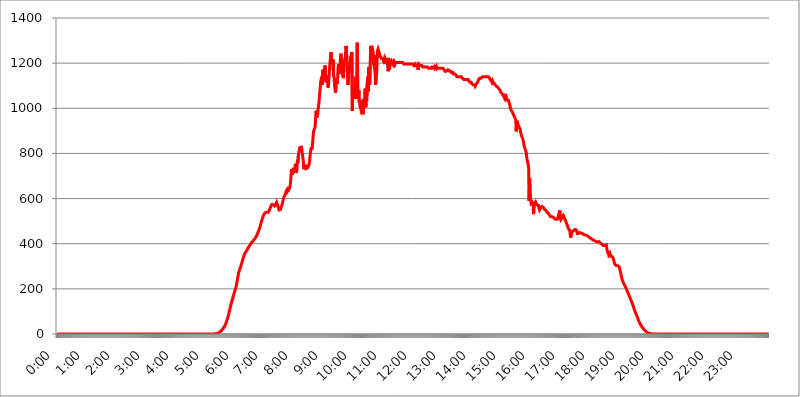
| Category | 2015.04.21. Intenzitás [W/m^2] |
|---|---|
| 0.0 | -0.256 |
| 0.0006944444444444445 | -0.256 |
| 0.001388888888888889 | -0.256 |
| 0.0020833333333333333 | -0.256 |
| 0.002777777777777778 | -0.256 |
| 0.003472222222222222 | -0.256 |
| 0.004166666666666667 | -0.256 |
| 0.004861111111111111 | -0.256 |
| 0.005555555555555556 | -0.256 |
| 0.0062499999999999995 | -0.256 |
| 0.006944444444444444 | -0.256 |
| 0.007638888888888889 | -0.256 |
| 0.008333333333333333 | -0.256 |
| 0.009027777777777779 | -0.256 |
| 0.009722222222222222 | -0.256 |
| 0.010416666666666666 | -0.256 |
| 0.011111111111111112 | -0.256 |
| 0.011805555555555555 | -0.256 |
| 0.012499999999999999 | -0.256 |
| 0.013194444444444444 | -0.256 |
| 0.013888888888888888 | -0.256 |
| 0.014583333333333332 | -0.256 |
| 0.015277777777777777 | -0.256 |
| 0.015972222222222224 | -0.256 |
| 0.016666666666666666 | -0.256 |
| 0.017361111111111112 | -0.256 |
| 0.018055555555555557 | -0.256 |
| 0.01875 | -0.256 |
| 0.019444444444444445 | -0.256 |
| 0.02013888888888889 | -0.256 |
| 0.020833333333333332 | -0.256 |
| 0.02152777777777778 | -0.256 |
| 0.022222222222222223 | -0.256 |
| 0.02291666666666667 | -0.256 |
| 0.02361111111111111 | -0.256 |
| 0.024305555555555556 | -0.256 |
| 0.024999999999999998 | -0.256 |
| 0.025694444444444447 | -0.256 |
| 0.02638888888888889 | -0.256 |
| 0.027083333333333334 | -0.256 |
| 0.027777777777777776 | -0.256 |
| 0.02847222222222222 | -0.256 |
| 0.029166666666666664 | -0.256 |
| 0.029861111111111113 | -0.256 |
| 0.030555555555555555 | -0.256 |
| 0.03125 | -0.256 |
| 0.03194444444444445 | -0.256 |
| 0.03263888888888889 | -0.256 |
| 0.03333333333333333 | -0.256 |
| 0.034027777777777775 | -0.256 |
| 0.034722222222222224 | -0.256 |
| 0.035416666666666666 | -0.256 |
| 0.036111111111111115 | -0.256 |
| 0.03680555555555556 | -0.256 |
| 0.0375 | -0.256 |
| 0.03819444444444444 | -0.256 |
| 0.03888888888888889 | -0.256 |
| 0.03958333333333333 | -0.256 |
| 0.04027777777777778 | -0.256 |
| 0.04097222222222222 | -0.256 |
| 0.041666666666666664 | -0.256 |
| 0.042361111111111106 | -0.256 |
| 0.04305555555555556 | -0.256 |
| 0.043750000000000004 | -0.256 |
| 0.044444444444444446 | -0.256 |
| 0.04513888888888889 | -0.256 |
| 0.04583333333333334 | -0.256 |
| 0.04652777777777778 | -0.256 |
| 0.04722222222222222 | -0.256 |
| 0.04791666666666666 | -0.256 |
| 0.04861111111111111 | -0.256 |
| 0.049305555555555554 | -0.256 |
| 0.049999999999999996 | -0.256 |
| 0.05069444444444445 | -0.256 |
| 0.051388888888888894 | -0.256 |
| 0.052083333333333336 | -0.256 |
| 0.05277777777777778 | -0.256 |
| 0.05347222222222222 | -0.256 |
| 0.05416666666666667 | -0.256 |
| 0.05486111111111111 | -0.256 |
| 0.05555555555555555 | -0.256 |
| 0.05625 | -0.256 |
| 0.05694444444444444 | -0.256 |
| 0.057638888888888885 | -0.256 |
| 0.05833333333333333 | -0.256 |
| 0.05902777777777778 | -0.256 |
| 0.059722222222222225 | -0.256 |
| 0.06041666666666667 | -0.256 |
| 0.061111111111111116 | -0.256 |
| 0.06180555555555556 | -0.256 |
| 0.0625 | -0.256 |
| 0.06319444444444444 | -0.256 |
| 0.06388888888888888 | -0.256 |
| 0.06458333333333334 | -0.256 |
| 0.06527777777777778 | -0.256 |
| 0.06597222222222222 | -0.256 |
| 0.06666666666666667 | -0.256 |
| 0.06736111111111111 | -0.256 |
| 0.06805555555555555 | -0.256 |
| 0.06874999999999999 | -0.256 |
| 0.06944444444444443 | -0.256 |
| 0.07013888888888889 | -0.256 |
| 0.07083333333333333 | -0.256 |
| 0.07152777777777779 | -0.256 |
| 0.07222222222222223 | -0.256 |
| 0.07291666666666667 | -0.256 |
| 0.07361111111111111 | -0.256 |
| 0.07430555555555556 | -0.256 |
| 0.075 | -0.256 |
| 0.07569444444444444 | -0.256 |
| 0.0763888888888889 | -0.256 |
| 0.07708333333333334 | -0.256 |
| 0.07777777777777778 | -0.256 |
| 0.07847222222222222 | -0.256 |
| 0.07916666666666666 | -0.256 |
| 0.0798611111111111 | -0.256 |
| 0.08055555555555556 | -0.256 |
| 0.08125 | -0.256 |
| 0.08194444444444444 | -0.256 |
| 0.08263888888888889 | -0.256 |
| 0.08333333333333333 | -0.256 |
| 0.08402777777777777 | -0.256 |
| 0.08472222222222221 | -0.256 |
| 0.08541666666666665 | -0.256 |
| 0.08611111111111112 | -0.256 |
| 0.08680555555555557 | -0.256 |
| 0.08750000000000001 | -0.256 |
| 0.08819444444444445 | -0.256 |
| 0.08888888888888889 | -0.256 |
| 0.08958333333333333 | -0.256 |
| 0.09027777777777778 | -0.256 |
| 0.09097222222222222 | -0.256 |
| 0.09166666666666667 | -0.256 |
| 0.09236111111111112 | -0.256 |
| 0.09305555555555556 | -0.256 |
| 0.09375 | -0.256 |
| 0.09444444444444444 | -0.256 |
| 0.09513888888888888 | -0.256 |
| 0.09583333333333333 | -0.256 |
| 0.09652777777777777 | -0.256 |
| 0.09722222222222222 | -0.256 |
| 0.09791666666666667 | -0.256 |
| 0.09861111111111111 | -0.256 |
| 0.09930555555555555 | -0.256 |
| 0.09999999999999999 | -0.256 |
| 0.10069444444444443 | -0.256 |
| 0.1013888888888889 | -0.256 |
| 0.10208333333333335 | -0.256 |
| 0.10277777777777779 | -0.256 |
| 0.10347222222222223 | -0.256 |
| 0.10416666666666667 | -0.256 |
| 0.10486111111111111 | -0.256 |
| 0.10555555555555556 | -0.256 |
| 0.10625 | -0.256 |
| 0.10694444444444444 | -0.256 |
| 0.1076388888888889 | -0.256 |
| 0.10833333333333334 | -0.256 |
| 0.10902777777777778 | -0.256 |
| 0.10972222222222222 | -0.256 |
| 0.1111111111111111 | -0.256 |
| 0.11180555555555556 | -0.256 |
| 0.11180555555555556 | -0.256 |
| 0.1125 | -0.256 |
| 0.11319444444444444 | -0.256 |
| 0.11388888888888889 | -0.256 |
| 0.11458333333333333 | -0.256 |
| 0.11527777777777777 | -0.256 |
| 0.11597222222222221 | -0.256 |
| 0.11666666666666665 | -0.256 |
| 0.1173611111111111 | -0.256 |
| 0.11805555555555557 | -0.256 |
| 0.11944444444444445 | -0.256 |
| 0.12013888888888889 | -0.256 |
| 0.12083333333333333 | -0.256 |
| 0.12152777777777778 | -0.256 |
| 0.12222222222222223 | -0.256 |
| 0.12291666666666667 | -0.256 |
| 0.12291666666666667 | -0.256 |
| 0.12361111111111112 | -0.256 |
| 0.12430555555555556 | -0.256 |
| 0.125 | -0.256 |
| 0.12569444444444444 | -0.256 |
| 0.12638888888888888 | -0.256 |
| 0.12708333333333333 | -0.256 |
| 0.16875 | -0.256 |
| 0.12847222222222224 | -0.256 |
| 0.12916666666666668 | -0.256 |
| 0.12986111111111112 | -0.256 |
| 0.13055555555555556 | -0.256 |
| 0.13125 | -0.256 |
| 0.13194444444444445 | -0.256 |
| 0.1326388888888889 | -0.256 |
| 0.13333333333333333 | -0.256 |
| 0.13402777777777777 | -0.256 |
| 0.13402777777777777 | -0.256 |
| 0.13472222222222222 | -0.256 |
| 0.13541666666666666 | -0.256 |
| 0.1361111111111111 | -0.256 |
| 0.13749999999999998 | -0.256 |
| 0.13819444444444443 | -0.256 |
| 0.1388888888888889 | -0.256 |
| 0.13958333333333334 | -0.256 |
| 0.14027777777777778 | -0.256 |
| 0.14097222222222222 | -0.256 |
| 0.14166666666666666 | -0.256 |
| 0.1423611111111111 | -0.256 |
| 0.14305555555555557 | -0.256 |
| 0.14375000000000002 | -0.256 |
| 0.14444444444444446 | -0.256 |
| 0.1451388888888889 | -0.256 |
| 0.1451388888888889 | -0.256 |
| 0.14652777777777778 | -0.256 |
| 0.14722222222222223 | -0.256 |
| 0.14791666666666667 | -0.256 |
| 0.1486111111111111 | -0.256 |
| 0.14930555555555555 | -0.256 |
| 0.15 | -0.256 |
| 0.15069444444444444 | -0.256 |
| 0.15138888888888888 | -0.256 |
| 0.15208333333333332 | -0.256 |
| 0.15277777777777776 | -0.256 |
| 0.15347222222222223 | -0.256 |
| 0.15416666666666667 | -0.256 |
| 0.15486111111111112 | -0.256 |
| 0.15555555555555556 | -0.256 |
| 0.15625 | -0.256 |
| 0.15694444444444444 | -0.256 |
| 0.15763888888888888 | -0.256 |
| 0.15833333333333333 | -0.256 |
| 0.15902777777777777 | -0.256 |
| 0.15972222222222224 | -0.256 |
| 0.16041666666666668 | -0.256 |
| 0.16111111111111112 | -0.256 |
| 0.16180555555555556 | -0.256 |
| 0.1625 | -0.256 |
| 0.16319444444444445 | -0.256 |
| 0.1638888888888889 | -0.256 |
| 0.16458333333333333 | -0.256 |
| 0.16527777777777777 | -0.256 |
| 0.16597222222222222 | -0.256 |
| 0.16666666666666666 | -0.256 |
| 0.1673611111111111 | -0.256 |
| 0.16805555555555554 | -0.256 |
| 0.16874999999999998 | -0.256 |
| 0.16944444444444443 | -0.256 |
| 0.17013888888888887 | -0.256 |
| 0.1708333333333333 | -0.256 |
| 0.17152777777777775 | -0.256 |
| 0.17222222222222225 | -0.256 |
| 0.1729166666666667 | -0.256 |
| 0.17361111111111113 | -0.256 |
| 0.17430555555555557 | -0.256 |
| 0.17500000000000002 | -0.256 |
| 0.17569444444444446 | -0.256 |
| 0.1763888888888889 | -0.256 |
| 0.17708333333333334 | -0.256 |
| 0.17777777777777778 | -0.256 |
| 0.17847222222222223 | -0.256 |
| 0.17916666666666667 | -0.256 |
| 0.1798611111111111 | -0.256 |
| 0.18055555555555555 | -0.256 |
| 0.18125 | -0.256 |
| 0.18194444444444444 | -0.256 |
| 0.1826388888888889 | -0.256 |
| 0.18333333333333335 | -0.256 |
| 0.1840277777777778 | -0.256 |
| 0.18472222222222223 | -0.256 |
| 0.18541666666666667 | -0.256 |
| 0.18611111111111112 | -0.256 |
| 0.18680555555555556 | -0.256 |
| 0.1875 | -0.256 |
| 0.18819444444444444 | -0.256 |
| 0.18888888888888888 | -0.256 |
| 0.18958333333333333 | -0.256 |
| 0.19027777777777777 | -0.256 |
| 0.1909722222222222 | -0.256 |
| 0.19166666666666665 | -0.256 |
| 0.19236111111111112 | -0.256 |
| 0.19305555555555554 | -0.256 |
| 0.19375 | -0.256 |
| 0.19444444444444445 | -0.256 |
| 0.1951388888888889 | -0.256 |
| 0.19583333333333333 | -0.256 |
| 0.19652777777777777 | -0.256 |
| 0.19722222222222222 | -0.256 |
| 0.19791666666666666 | -0.256 |
| 0.1986111111111111 | -0.256 |
| 0.19930555555555554 | -0.256 |
| 0.19999999999999998 | -0.256 |
| 0.20069444444444443 | -0.256 |
| 0.20138888888888887 | -0.256 |
| 0.2020833333333333 | -0.256 |
| 0.2027777777777778 | -0.256 |
| 0.2034722222222222 | -0.256 |
| 0.2041666666666667 | -0.256 |
| 0.20486111111111113 | -0.256 |
| 0.20555555555555557 | -0.256 |
| 0.20625000000000002 | -0.256 |
| 0.20694444444444446 | -0.256 |
| 0.2076388888888889 | -0.256 |
| 0.20833333333333334 | -0.256 |
| 0.20902777777777778 | -0.256 |
| 0.20972222222222223 | -0.256 |
| 0.21041666666666667 | -0.256 |
| 0.2111111111111111 | -0.256 |
| 0.21180555555555555 | -0.256 |
| 0.2125 | -0.256 |
| 0.21319444444444444 | -0.256 |
| 0.2138888888888889 | -0.256 |
| 0.21458333333333335 | -0.256 |
| 0.2152777777777778 | -0.256 |
| 0.21597222222222223 | -0.256 |
| 0.21666666666666667 | -0.256 |
| 0.21736111111111112 | -0.256 |
| 0.21805555555555556 | -0.256 |
| 0.21875 | -0.256 |
| 0.21944444444444444 | -0.256 |
| 0.22013888888888888 | -0.256 |
| 0.22083333333333333 | 1.09 |
| 0.22152777777777777 | 1.09 |
| 0.2222222222222222 | 1.09 |
| 0.22291666666666665 | 1.09 |
| 0.2236111111111111 | 2.439 |
| 0.22430555555555556 | 3.791 |
| 0.225 | 3.791 |
| 0.22569444444444445 | 5.146 |
| 0.2263888888888889 | 6.503 |
| 0.22708333333333333 | 6.503 |
| 0.22777777777777777 | 7.862 |
| 0.22847222222222222 | 9.225 |
| 0.22916666666666666 | 11.956 |
| 0.2298611111111111 | 13.325 |
| 0.23055555555555554 | 16.069 |
| 0.23124999999999998 | 18.822 |
| 0.23194444444444443 | 21.582 |
| 0.23263888888888887 | 24.35 |
| 0.2333333333333333 | 27.124 |
| 0.2340277777777778 | 31.297 |
| 0.2347222222222222 | 34.086 |
| 0.2354166666666667 | 38.28 |
| 0.23611111111111113 | 42.483 |
| 0.23680555555555557 | 49.507 |
| 0.23750000000000002 | 56.548 |
| 0.23819444444444446 | 63.6 |
| 0.2388888888888889 | 70.658 |
| 0.23958333333333334 | 76.304 |
| 0.24027777777777778 | 84.766 |
| 0.24097222222222223 | 94.617 |
| 0.24166666666666667 | 104.435 |
| 0.2423611111111111 | 114.207 |
| 0.24305555555555555 | 122.538 |
| 0.24375 | 130.821 |
| 0.24444444444444446 | 140.417 |
| 0.24513888888888888 | 148.579 |
| 0.24583333333333335 | 155.333 |
| 0.2465277777777778 | 162.042 |
| 0.24722222222222223 | 170.029 |
| 0.24791666666666667 | 179.258 |
| 0.24861111111111112 | 185.79 |
| 0.24930555555555556 | 193.561 |
| 0.25 | 199.98 |
| 0.25069444444444444 | 207.615 |
| 0.2513888888888889 | 217.681 |
| 0.2520833333333333 | 230.083 |
| 0.25277777777777777 | 241.083 |
| 0.2534722222222222 | 254.333 |
| 0.25416666666666665 | 267.396 |
| 0.2548611111111111 | 275.626 |
| 0.2555555555555556 | 282.637 |
| 0.25625000000000003 | 289.616 |
| 0.2569444444444445 | 296.571 |
| 0.2576388888888889 | 302.353 |
| 0.25833333333333336 | 309.284 |
| 0.2590277777777778 | 316.215 |
| 0.25972222222222224 | 324.314 |
| 0.2604166666666667 | 332.443 |
| 0.2611111111111111 | 339.449 |
| 0.26180555555555557 | 346.501 |
| 0.2625 | 352.423 |
| 0.26319444444444445 | 357.196 |
| 0.2638888888888889 | 360.798 |
| 0.26458333333333334 | 364.422 |
| 0.2652777777777778 | 366.851 |
| 0.2659722222222222 | 370.515 |
| 0.26666666666666666 | 374.206 |
| 0.2673611111111111 | 379.171 |
| 0.26805555555555555 | 382.93 |
| 0.26875 | 386.723 |
| 0.26944444444444443 | 390.55 |
| 0.2701388888888889 | 393.122 |
| 0.2708333333333333 | 397.012 |
| 0.27152777777777776 | 400.943 |
| 0.2722222222222222 | 403.587 |
| 0.27291666666666664 | 404.916 |
| 0.2736111111111111 | 407.589 |
| 0.2743055555555555 | 410.283 |
| 0.27499999999999997 | 414.364 |
| 0.27569444444444446 | 415.735 |
| 0.27638888888888885 | 418.495 |
| 0.27708333333333335 | 422.678 |
| 0.2777777777777778 | 425.497 |
| 0.27847222222222223 | 428.341 |
| 0.2791666666666667 | 432.656 |
| 0.2798611111111111 | 437.031 |
| 0.28055555555555556 | 442.962 |
| 0.28125 | 447.487 |
| 0.28194444444444444 | 453.629 |
| 0.2826388888888889 | 458.318 |
| 0.2833333333333333 | 464.688 |
| 0.28402777777777777 | 471.198 |
| 0.2847222222222222 | 477.854 |
| 0.28541666666666665 | 486.389 |
| 0.28611111111111115 | 495.176 |
| 0.28680555555555554 | 502.396 |
| 0.28750000000000003 | 509.793 |
| 0.2881944444444445 | 515.462 |
| 0.2888888888888889 | 523.186 |
| 0.28958333333333336 | 527.122 |
| 0.2902777777777778 | 531.108 |
| 0.29097222222222224 | 533.12 |
| 0.2916666666666667 | 537.182 |
| 0.2923611111111111 | 537.182 |
| 0.29305555555555557 | 539.234 |
| 0.29375 | 539.234 |
| 0.29444444444444445 | 539.234 |
| 0.2951388888888889 | 539.234 |
| 0.29583333333333334 | 539.234 |
| 0.2965277777777778 | 541.298 |
| 0.2972222222222222 | 545.467 |
| 0.29791666666666666 | 551.823 |
| 0.2986111111111111 | 558.305 |
| 0.29930555555555555 | 562.699 |
| 0.3 | 569.398 |
| 0.30069444444444443 | 571.661 |
| 0.3013888888888889 | 573.939 |
| 0.3020833333333333 | 573.939 |
| 0.30277777777777776 | 573.939 |
| 0.3034722222222222 | 571.661 |
| 0.30416666666666664 | 569.398 |
| 0.3048611111111111 | 567.15 |
| 0.3055555555555555 | 567.15 |
| 0.30624999999999997 | 571.661 |
| 0.3069444444444444 | 578.542 |
| 0.3076388888888889 | 583.206 |
| 0.30833333333333335 | 580.866 |
| 0.3090277777777778 | 569.398 |
| 0.30972222222222223 | 569.398 |
| 0.3104166666666667 | 558.305 |
| 0.3111111111111111 | 549.691 |
| 0.31180555555555556 | 547.572 |
| 0.3125 | 551.823 |
| 0.31319444444444444 | 551.823 |
| 0.3138888888888889 | 560.495 |
| 0.3145833333333333 | 567.15 |
| 0.31527777777777777 | 571.661 |
| 0.3159722222222222 | 580.866 |
| 0.31666666666666665 | 592.725 |
| 0.31736111111111115 | 600.035 |
| 0.31805555555555554 | 607.495 |
| 0.31875000000000003 | 612.554 |
| 0.3194444444444445 | 615.11 |
| 0.3201388888888889 | 620.273 |
| 0.32083333333333336 | 630.814 |
| 0.3215277777777778 | 633.495 |
| 0.32222222222222224 | 638.912 |
| 0.3229166666666667 | 630.814 |
| 0.3236111111111111 | 628.152 |
| 0.32430555555555557 | 628.152 |
| 0.325 | 638.912 |
| 0.32569444444444445 | 647.179 |
| 0.3263888888888889 | 652.786 |
| 0.32708333333333334 | 667.146 |
| 0.3277777777777778 | 694.278 |
| 0.3284722222222222 | 729.817 |
| 0.32916666666666666 | 719.855 |
| 0.3298611111111111 | 706.89 |
| 0.33055555555555555 | 713.328 |
| 0.33125 | 736.574 |
| 0.33194444444444443 | 723.153 |
| 0.3326388888888889 | 716.58 |
| 0.3333333333333333 | 729.817 |
| 0.3340277777777778 | 753.881 |
| 0.3347222222222222 | 713.328 |
| 0.3354166666666667 | 716.58 |
| 0.3361111111111111 | 729.817 |
| 0.3368055555555556 | 768.162 |
| 0.33749999999999997 | 757.414 |
| 0.33819444444444446 | 790.334 |
| 0.33888888888888885 | 786.575 |
| 0.33958333333333335 | 786.575 |
| 0.34027777777777773 | 829.377 |
| 0.34097222222222223 | 809.522 |
| 0.3416666666666666 | 821.353 |
| 0.3423611111111111 | 833.43 |
| 0.3430555555555555 | 809.522 |
| 0.34375 | 797.931 |
| 0.3444444444444445 | 782.842 |
| 0.3451388888888889 | 764.555 |
| 0.3458333333333334 | 729.817 |
| 0.34652777777777777 | 739.988 |
| 0.34722222222222227 | 743.425 |
| 0.34791666666666665 | 739.988 |
| 0.34861111111111115 | 743.425 |
| 0.34930555555555554 | 733.184 |
| 0.35000000000000003 | 733.184 |
| 0.3506944444444444 | 729.817 |
| 0.3513888888888889 | 736.574 |
| 0.3520833333333333 | 739.988 |
| 0.3527777777777778 | 733.184 |
| 0.3534722222222222 | 753.881 |
| 0.3541666666666667 | 775.451 |
| 0.3548611111111111 | 797.931 |
| 0.35555555555555557 | 813.439 |
| 0.35625 | 825.351 |
| 0.35694444444444445 | 817.382 |
| 0.3576388888888889 | 829.377 |
| 0.35833333333333334 | 854.113 |
| 0.3590277777777778 | 879.878 |
| 0.3597222222222222 | 902.16 |
| 0.36041666666666666 | 902.16 |
| 0.3611111111111111 | 911.285 |
| 0.36180555555555555 | 920.533 |
| 0.3625 | 963.712 |
| 0.36319444444444443 | 988.839 |
| 0.3638888888888889 | 958.785 |
| 0.3645833333333333 | 963.712 |
| 0.3652777777777778 | 973.663 |
| 0.3659722222222222 | 999.125 |
| 0.3666666666666667 | 1014.809 |
| 0.3673611111111111 | 1036.206 |
| 0.3680555555555556 | 1063.751 |
| 0.36874999999999997 | 1063.751 |
| 0.36944444444444446 | 1115.634 |
| 0.37013888888888885 | 1127.578 |
| 0.37083333333333335 | 1139.675 |
| 0.37152777777777773 | 1103.843 |
| 0.37222222222222223 | 1170.601 |
| 0.3729166666666666 | 1158.113 |
| 0.3736111111111111 | 1139.675 |
| 0.3743055555555555 | 1139.675 |
| 0.375 | 1176.905 |
| 0.3756944444444445 | 1189.633 |
| 0.3763888888888889 | 1127.578 |
| 0.3770833333333334 | 1115.634 |
| 0.37777777777777777 | 1145.782 |
| 0.37847222222222227 | 1139.675 |
| 0.37916666666666665 | 1115.634 |
| 0.37986111111111115 | 1092.203 |
| 0.38055555555555554 | 1109.72 |
| 0.38125000000000003 | 1145.782 |
| 0.3819444444444444 | 1176.905 |
| 0.3826388888888889 | 1202.523 |
| 0.3833333333333333 | 1228.794 |
| 0.3840277777777778 | 1248.934 |
| 0.3847222222222222 | 1209.029 |
| 0.3854166666666667 | 1215.576 |
| 0.3861111111111111 | 1196.058 |
| 0.38680555555555557 | 1215.576 |
| 0.3875 | 1145.782 |
| 0.38819444444444445 | 1139.675 |
| 0.3888888888888889 | 1103.843 |
| 0.38958333333333334 | 1103.843 |
| 0.3902777777777778 | 1069.368 |
| 0.3909722222222222 | 1098.004 |
| 0.39166666666666666 | 1133.607 |
| 0.3923611111111111 | 1109.72 |
| 0.39305555555555555 | 1115.634 |
| 0.39375 | 1176.905 |
| 0.39444444444444443 | 1196.058 |
| 0.3951388888888889 | 1151.928 |
| 0.3958333333333333 | 1151.928 |
| 0.3965277777777778 | 1170.601 |
| 0.3972222222222222 | 1222.164 |
| 0.3979166666666667 | 1242.179 |
| 0.3986111111111111 | 1189.633 |
| 0.3993055555555556 | 1164.337 |
| 0.39999999999999997 | 1176.905 |
| 0.40069444444444446 | 1139.675 |
| 0.40138888888888885 | 1133.607 |
| 0.40208333333333335 | 1196.058 |
| 0.40277777777777773 | 1215.576 |
| 0.40347222222222223 | 1209.029 |
| 0.4041666666666666 | 1228.794 |
| 0.4048611111111111 | 1276.38 |
| 0.4055555555555555 | 1262.571 |
| 0.40625 | 1209.029 |
| 0.4069444444444445 | 1164.337 |
| 0.4076388888888889 | 1103.843 |
| 0.4083333333333334 | 1139.675 |
| 0.40902777777777777 | 1164.337 |
| 0.40972222222222227 | 1164.337 |
| 0.41041666666666665 | 1196.058 |
| 0.41111111111111115 | 1228.794 |
| 0.41180555555555554 | 1170.601 |
| 0.41250000000000003 | 1235.465 |
| 0.4131944444444444 | 1248.934 |
| 0.4138888888888889 | 988.839 |
| 0.4145833333333333 | 1092.203 |
| 0.4152777777777778 | 1052.625 |
| 0.4159722222222222 | 1063.751 |
| 0.4166666666666667 | 1047.117 |
| 0.4173611111111111 | 1052.625 |
| 0.41805555555555557 | 1041.644 |
| 0.41875 | 1139.675 |
| 0.41944444444444445 | 1139.675 |
| 0.4201388888888889 | 1058.17 |
| 0.42083333333333334 | 1290.36 |
| 0.4215277777777778 | 1058.17 |
| 0.4222222222222222 | 1041.644 |
| 0.42291666666666666 | 1080.711 |
| 0.4236111111111111 | 1025.437 |
| 0.42430555555555555 | 1030.804 |
| 0.425 | 1004.318 |
| 0.42569444444444443 | 999.125 |
| 0.4263888888888889 | 988.839 |
| 0.4270833333333333 | 993.965 |
| 0.4277777777777778 | 1036.206 |
| 0.4284722222222222 | 978.688 |
| 0.4291666666666667 | 973.663 |
| 0.4298611111111111 | 1041.644 |
| 0.4305555555555556 | 1041.644 |
| 0.43124999999999997 | 1009.546 |
| 0.43194444444444446 | 1086.439 |
| 0.43263888888888885 | 1004.318 |
| 0.43333333333333335 | 1036.206 |
| 0.43402777777777773 | 1030.804 |
| 0.43472222222222223 | 1109.72 |
| 0.4354166666666666 | 1139.675 |
| 0.4361111111111111 | 1075.021 |
| 0.4368055555555555 | 1183.249 |
| 0.4375 | 1115.634 |
| 0.4381944444444445 | 1103.843 |
| 0.4388888888888889 | 1189.633 |
| 0.4395833333333334 | 1276.38 |
| 0.44027777777777777 | 1215.576 |
| 0.44097222222222227 | 1276.38 |
| 0.44166666666666665 | 1269.454 |
| 0.44236111111111115 | 1269.454 |
| 0.44305555555555554 | 1248.934 |
| 0.44375000000000003 | 1189.633 |
| 0.4444444444444444 | 1235.465 |
| 0.4451388888888889 | 1176.905 |
| 0.4458333333333333 | 1151.928 |
| 0.4465277777777778 | 1103.843 |
| 0.4472222222222222 | 1133.607 |
| 0.4479166666666667 | 1151.928 |
| 0.4486111111111111 | 1215.576 |
| 0.44930555555555557 | 1255.731 |
| 0.45 | 1262.571 |
| 0.45069444444444445 | 1255.731 |
| 0.4513888888888889 | 1248.934 |
| 0.45208333333333334 | 1235.465 |
| 0.4527777777777778 | 1235.465 |
| 0.4534722222222222 | 1228.794 |
| 0.45416666666666666 | 1222.164 |
| 0.4548611111111111 | 1222.164 |
| 0.45555555555555555 | 1222.164 |
| 0.45625 | 1222.164 |
| 0.45694444444444443 | 1215.576 |
| 0.4576388888888889 | 1215.576 |
| 0.4583333333333333 | 1202.523 |
| 0.4590277777777778 | 1196.058 |
| 0.4597222222222222 | 1222.164 |
| 0.4604166666666667 | 1222.164 |
| 0.4611111111111111 | 1222.164 |
| 0.4618055555555556 | 1209.029 |
| 0.46249999999999997 | 1222.164 |
| 0.46319444444444446 | 1215.576 |
| 0.46388888888888885 | 1164.337 |
| 0.46458333333333335 | 1176.905 |
| 0.46527777777777773 | 1209.029 |
| 0.46597222222222223 | 1170.601 |
| 0.4666666666666666 | 1209.029 |
| 0.4673611111111111 | 1209.029 |
| 0.4680555555555555 | 1202.523 |
| 0.46875 | 1209.029 |
| 0.4694444444444445 | 1209.029 |
| 0.4701388888888889 | 1209.029 |
| 0.4708333333333334 | 1196.058 |
| 0.47152777777777777 | 1202.523 |
| 0.47222222222222227 | 1196.058 |
| 0.47291666666666665 | 1202.523 |
| 0.47361111111111115 | 1196.058 |
| 0.47430555555555554 | 1202.523 |
| 0.47500000000000003 | 1202.523 |
| 0.4756944444444444 | 1202.523 |
| 0.4763888888888889 | 1202.523 |
| 0.4770833333333333 | 1202.523 |
| 0.4777777777777778 | 1202.523 |
| 0.4784722222222222 | 1202.523 |
| 0.4791666666666667 | 1202.523 |
| 0.4798611111111111 | 1202.523 |
| 0.48055555555555557 | 1202.523 |
| 0.48125 | 1202.523 |
| 0.48194444444444445 | 1202.523 |
| 0.4826388888888889 | 1202.523 |
| 0.48333333333333334 | 1202.523 |
| 0.4840277777777778 | 1202.523 |
| 0.4847222222222222 | 1202.523 |
| 0.48541666666666666 | 1202.523 |
| 0.4861111111111111 | 1196.058 |
| 0.48680555555555555 | 1196.058 |
| 0.4875 | 1196.058 |
| 0.48819444444444443 | 1196.058 |
| 0.4888888888888889 | 1196.058 |
| 0.4895833333333333 | 1196.058 |
| 0.4902777777777778 | 1196.058 |
| 0.4909722222222222 | 1196.058 |
| 0.4916666666666667 | 1196.058 |
| 0.4923611111111111 | 1196.058 |
| 0.4930555555555556 | 1196.058 |
| 0.49374999999999997 | 1196.058 |
| 0.49444444444444446 | 1196.058 |
| 0.49513888888888885 | 1196.058 |
| 0.49583333333333335 | 1196.058 |
| 0.49652777777777773 | 1196.058 |
| 0.49722222222222223 | 1196.058 |
| 0.4979166666666666 | 1196.058 |
| 0.4986111111111111 | 1196.058 |
| 0.4993055555555555 | 1196.058 |
| 0.5 | 1189.633 |
| 0.5006944444444444 | 1189.633 |
| 0.5013888888888889 | 1189.633 |
| 0.5020833333333333 | 1196.058 |
| 0.5027777777777778 | 1189.633 |
| 0.5034722222222222 | 1189.633 |
| 0.5041666666666667 | 1189.633 |
| 0.5048611111111111 | 1189.633 |
| 0.5055555555555555 | 1189.633 |
| 0.50625 | 1170.601 |
| 0.5069444444444444 | 1196.058 |
| 0.5076388888888889 | 1196.058 |
| 0.5083333333333333 | 1196.058 |
| 0.5090277777777777 | 1189.633 |
| 0.5097222222222222 | 1189.633 |
| 0.5104166666666666 | 1189.633 |
| 0.5111111111111112 | 1189.633 |
| 0.5118055555555555 | 1189.633 |
| 0.5125000000000001 | 1183.249 |
| 0.5131944444444444 | 1183.249 |
| 0.513888888888889 | 1183.249 |
| 0.5145833333333333 | 1183.249 |
| 0.5152777777777778 | 1183.249 |
| 0.5159722222222222 | 1183.249 |
| 0.5166666666666667 | 1183.249 |
| 0.517361111111111 | 1183.249 |
| 0.5180555555555556 | 1183.249 |
| 0.5187499999999999 | 1183.249 |
| 0.5194444444444445 | 1183.249 |
| 0.5201388888888888 | 1183.249 |
| 0.5208333333333334 | 1176.905 |
| 0.5215277777777778 | 1176.905 |
| 0.5222222222222223 | 1176.905 |
| 0.5229166666666667 | 1176.905 |
| 0.5236111111111111 | 1176.905 |
| 0.5243055555555556 | 1176.905 |
| 0.525 | 1176.905 |
| 0.5256944444444445 | 1183.249 |
| 0.5263888888888889 | 1183.249 |
| 0.5270833333333333 | 1183.249 |
| 0.5277777777777778 | 1183.249 |
| 0.5284722222222222 | 1183.249 |
| 0.5291666666666667 | 1176.905 |
| 0.5298611111111111 | 1183.249 |
| 0.5305555555555556 | 1183.249 |
| 0.53125 | 1176.905 |
| 0.5319444444444444 | 1183.249 |
| 0.5326388888888889 | 1176.905 |
| 0.5333333333333333 | 1176.905 |
| 0.5340277777777778 | 1176.905 |
| 0.5347222222222222 | 1176.905 |
| 0.5354166666666667 | 1176.905 |
| 0.5361111111111111 | 1176.905 |
| 0.5368055555555555 | 1176.905 |
| 0.5375 | 1176.905 |
| 0.5381944444444444 | 1176.905 |
| 0.5388888888888889 | 1176.905 |
| 0.5395833333333333 | 1176.905 |
| 0.5402777777777777 | 1176.905 |
| 0.5409722222222222 | 1176.905 |
| 0.5416666666666666 | 1176.905 |
| 0.5423611111111112 | 1170.601 |
| 0.5430555555555555 | 1170.601 |
| 0.5437500000000001 | 1164.337 |
| 0.5444444444444444 | 1164.337 |
| 0.545138888888889 | 1164.337 |
| 0.5458333333333333 | 1164.337 |
| 0.5465277777777778 | 1164.337 |
| 0.5472222222222222 | 1164.337 |
| 0.5479166666666667 | 1170.601 |
| 0.548611111111111 | 1170.601 |
| 0.5493055555555556 | 1170.601 |
| 0.5499999999999999 | 1164.337 |
| 0.5506944444444445 | 1164.337 |
| 0.5513888888888888 | 1164.337 |
| 0.5520833333333334 | 1164.337 |
| 0.5527777777777778 | 1158.113 |
| 0.5534722222222223 | 1158.113 |
| 0.5541666666666667 | 1158.113 |
| 0.5548611111111111 | 1158.113 |
| 0.5555555555555556 | 1151.928 |
| 0.55625 | 1151.928 |
| 0.5569444444444445 | 1151.928 |
| 0.5576388888888889 | 1151.928 |
| 0.5583333333333333 | 1151.928 |
| 0.5590277777777778 | 1151.928 |
| 0.5597222222222222 | 1145.782 |
| 0.5604166666666667 | 1139.675 |
| 0.5611111111111111 | 1139.675 |
| 0.5618055555555556 | 1139.675 |
| 0.5625 | 1139.675 |
| 0.5631944444444444 | 1139.675 |
| 0.5638888888888889 | 1139.675 |
| 0.5645833333333333 | 1139.675 |
| 0.5652777777777778 | 1139.675 |
| 0.5659722222222222 | 1139.675 |
| 0.5666666666666667 | 1139.675 |
| 0.5673611111111111 | 1139.675 |
| 0.5680555555555555 | 1133.607 |
| 0.56875 | 1133.607 |
| 0.5694444444444444 | 1133.607 |
| 0.5701388888888889 | 1127.578 |
| 0.5708333333333333 | 1127.578 |
| 0.5715277777777777 | 1127.578 |
| 0.5722222222222222 | 1127.578 |
| 0.5729166666666666 | 1127.578 |
| 0.5736111111111112 | 1127.578 |
| 0.5743055555555555 | 1127.578 |
| 0.5750000000000001 | 1127.578 |
| 0.5756944444444444 | 1127.578 |
| 0.576388888888889 | 1127.578 |
| 0.5770833333333333 | 1121.587 |
| 0.5777777777777778 | 1121.587 |
| 0.5784722222222222 | 1115.634 |
| 0.5791666666666667 | 1115.634 |
| 0.579861111111111 | 1115.634 |
| 0.5805555555555556 | 1115.634 |
| 0.5812499999999999 | 1109.72 |
| 0.5819444444444445 | 1109.72 |
| 0.5826388888888888 | 1109.72 |
| 0.5833333333333334 | 1103.843 |
| 0.5840277777777778 | 1103.843 |
| 0.5847222222222223 | 1103.843 |
| 0.5854166666666667 | 1103.843 |
| 0.5861111111111111 | 1098.004 |
| 0.5868055555555556 | 1098.004 |
| 0.5875 | 1098.004 |
| 0.5881944444444445 | 1109.72 |
| 0.5888888888888889 | 1109.72 |
| 0.5895833333333333 | 1115.634 |
| 0.5902777777777778 | 1121.587 |
| 0.5909722222222222 | 1127.578 |
| 0.5916666666666667 | 1127.578 |
| 0.5923611111111111 | 1133.607 |
| 0.5930555555555556 | 1133.607 |
| 0.59375 | 1133.607 |
| 0.5944444444444444 | 1133.607 |
| 0.5951388888888889 | 1133.607 |
| 0.5958333333333333 | 1133.607 |
| 0.5965277777777778 | 1139.675 |
| 0.5972222222222222 | 1139.675 |
| 0.5979166666666667 | 1139.675 |
| 0.5986111111111111 | 1139.675 |
| 0.5993055555555555 | 1139.675 |
| 0.6 | 1139.675 |
| 0.6006944444444444 | 1139.675 |
| 0.6013888888888889 | 1139.675 |
| 0.6020833333333333 | 1139.675 |
| 0.6027777777777777 | 1139.675 |
| 0.6034722222222222 | 1139.675 |
| 0.6041666666666666 | 1139.675 |
| 0.6048611111111112 | 1139.675 |
| 0.6055555555555555 | 1139.675 |
| 0.6062500000000001 | 1133.607 |
| 0.6069444444444444 | 1127.578 |
| 0.607638888888889 | 1127.578 |
| 0.6083333333333333 | 1127.578 |
| 0.6090277777777778 | 1121.587 |
| 0.6097222222222222 | 1115.634 |
| 0.6104166666666667 | 1121.587 |
| 0.611111111111111 | 1115.634 |
| 0.6118055555555556 | 1115.634 |
| 0.6124999999999999 | 1115.634 |
| 0.6131944444444445 | 1109.72 |
| 0.6138888888888888 | 1103.843 |
| 0.6145833333333334 | 1103.843 |
| 0.6152777777777778 | 1103.843 |
| 0.6159722222222223 | 1098.004 |
| 0.6166666666666667 | 1098.004 |
| 0.6173611111111111 | 1098.004 |
| 0.6180555555555556 | 1092.203 |
| 0.61875 | 1092.203 |
| 0.6194444444444445 | 1086.439 |
| 0.6201388888888889 | 1086.439 |
| 0.6208333333333333 | 1080.711 |
| 0.6215277777777778 | 1075.021 |
| 0.6222222222222222 | 1069.368 |
| 0.6229166666666667 | 1069.368 |
| 0.6236111111111111 | 1069.368 |
| 0.6243055555555556 | 1063.751 |
| 0.625 | 1058.17 |
| 0.6256944444444444 | 1058.17 |
| 0.6263888888888889 | 1052.625 |
| 0.6270833333333333 | 1047.117 |
| 0.6277777777777778 | 1052.625 |
| 0.6284722222222222 | 1047.117 |
| 0.6291666666666667 | 1041.644 |
| 0.6298611111111111 | 1047.117 |
| 0.6305555555555555 | 1036.206 |
| 0.63125 | 1036.206 |
| 0.6319444444444444 | 1036.206 |
| 0.6326388888888889 | 1036.206 |
| 0.6333333333333333 | 1030.804 |
| 0.6340277777777777 | 1020.106 |
| 0.6347222222222222 | 1014.809 |
| 0.6354166666666666 | 1004.318 |
| 0.6361111111111112 | 993.965 |
| 0.6368055555555555 | 993.965 |
| 0.6375000000000001 | 988.839 |
| 0.6381944444444444 | 983.747 |
| 0.638888888888889 | 978.688 |
| 0.6395833333333333 | 973.663 |
| 0.6402777777777778 | 973.663 |
| 0.6409722222222222 | 963.712 |
| 0.6416666666666667 | 958.785 |
| 0.642361111111111 | 953.892 |
| 0.6430555555555556 | 949.03 |
| 0.6437499999999999 | 897.643 |
| 0.6444444444444445 | 944.201 |
| 0.6451388888888888 | 939.404 |
| 0.6458333333333334 | 934.639 |
| 0.6465277777777778 | 925.203 |
| 0.6472222222222223 | 920.533 |
| 0.6479166666666667 | 915.893 |
| 0.6486111111111111 | 911.285 |
| 0.6493055555555556 | 906.707 |
| 0.65 | 893.157 |
| 0.6506944444444445 | 884.274 |
| 0.6513888888888889 | 875.511 |
| 0.6520833333333333 | 871.173 |
| 0.6527777777777778 | 866.865 |
| 0.6534722222222222 | 858.335 |
| 0.6541666666666667 | 845.755 |
| 0.6548611111111111 | 833.43 |
| 0.6555555555555556 | 825.351 |
| 0.65625 | 821.353 |
| 0.6569444444444444 | 813.439 |
| 0.6576388888888889 | 805.632 |
| 0.6583333333333333 | 786.575 |
| 0.6590277777777778 | 771.794 |
| 0.6597222222222222 | 760.972 |
| 0.6604166666666667 | 750.371 |
| 0.6611111111111111 | 736.574 |
| 0.6618055555555555 | 590.321 |
| 0.6625 | 691.18 |
| 0.6631944444444444 | 641.649 |
| 0.6638888888888889 | 597.582 |
| 0.6645833333333333 | 578.542 |
| 0.6652777777777777 | 580.866 |
| 0.6659722222222222 | 583.206 |
| 0.6666666666666666 | 578.542 |
| 0.6673611111111111 | 571.661 |
| 0.6680555555555556 | 531.108 |
| 0.6687500000000001 | 576.233 |
| 0.6694444444444444 | 576.233 |
| 0.6701388888888888 | 576.233 |
| 0.6708333333333334 | 585.562 |
| 0.6715277777777778 | 585.562 |
| 0.6722222222222222 | 576.233 |
| 0.6729166666666666 | 571.661 |
| 0.6736111111111112 | 573.939 |
| 0.6743055555555556 | 573.939 |
| 0.6749999999999999 | 569.398 |
| 0.6756944444444444 | 556.131 |
| 0.6763888888888889 | 549.691 |
| 0.6770833333333334 | 551.823 |
| 0.6777777777777777 | 558.305 |
| 0.6784722222222223 | 560.495 |
| 0.6791666666666667 | 562.699 |
| 0.6798611111111111 | 564.917 |
| 0.6805555555555555 | 567.15 |
| 0.68125 | 562.699 |
| 0.6819444444444445 | 560.495 |
| 0.6826388888888889 | 556.131 |
| 0.6833333333333332 | 551.823 |
| 0.6840277777777778 | 547.572 |
| 0.6847222222222222 | 549.691 |
| 0.6854166666666667 | 547.572 |
| 0.686111111111111 | 543.376 |
| 0.6868055555555556 | 539.234 |
| 0.6875 | 539.234 |
| 0.6881944444444444 | 537.182 |
| 0.688888888888889 | 535.145 |
| 0.6895833333333333 | 531.108 |
| 0.6902777777777778 | 527.122 |
| 0.6909722222222222 | 523.186 |
| 0.6916666666666668 | 521.237 |
| 0.6923611111111111 | 519.3 |
| 0.6930555555555555 | 519.3 |
| 0.69375 | 519.3 |
| 0.6944444444444445 | 519.3 |
| 0.6951388888888889 | 519.3 |
| 0.6958333333333333 | 517.375 |
| 0.6965277777777777 | 515.462 |
| 0.6972222222222223 | 511.671 |
| 0.6979166666666666 | 509.793 |
| 0.6986111111111111 | 507.927 |
| 0.6993055555555556 | 507.927 |
| 0.7000000000000001 | 506.072 |
| 0.7006944444444444 | 506.072 |
| 0.7013888888888888 | 507.927 |
| 0.7020833333333334 | 513.561 |
| 0.7027777777777778 | 523.186 |
| 0.7034722222222222 | 531.108 |
| 0.7041666666666666 | 541.298 |
| 0.7048611111111112 | 547.572 |
| 0.7055555555555556 | 511.671 |
| 0.7062499999999999 | 506.072 |
| 0.7069444444444444 | 507.927 |
| 0.7076388888888889 | 513.561 |
| 0.7083333333333334 | 515.462 |
| 0.7090277777777777 | 513.561 |
| 0.7097222222222223 | 525.148 |
| 0.7104166666666667 | 523.186 |
| 0.7111111111111111 | 515.462 |
| 0.7118055555555555 | 509.793 |
| 0.7125 | 506.072 |
| 0.7131944444444445 | 500.575 |
| 0.7138888888888889 | 493.398 |
| 0.7145833333333332 | 488.126 |
| 0.7152777777777778 | 481.238 |
| 0.7159722222222222 | 476.176 |
| 0.7166666666666667 | 469.557 |
| 0.717361111111111 | 464.688 |
| 0.7180555555555556 | 461.486 |
| 0.71875 | 459.898 |
| 0.7194444444444444 | 458.318 |
| 0.720138888888889 | 426.916 |
| 0.7208333333333333 | 431.211 |
| 0.7215277777777778 | 453.629 |
| 0.7222222222222222 | 453.629 |
| 0.7229166666666668 | 453.629 |
| 0.7236111111111111 | 455.184 |
| 0.7243055555555555 | 458.318 |
| 0.725 | 461.486 |
| 0.7256944444444445 | 463.083 |
| 0.7263888888888889 | 464.688 |
| 0.7270833333333333 | 463.083 |
| 0.7277777777777777 | 463.083 |
| 0.7284722222222223 | 458.318 |
| 0.7291666666666666 | 456.747 |
| 0.7298611111111111 | 439.982 |
| 0.7305555555555556 | 447.487 |
| 0.7312500000000001 | 449.011 |
| 0.7319444444444444 | 449.011 |
| 0.7326388888888888 | 449.011 |
| 0.7333333333333334 | 449.011 |
| 0.7340277777777778 | 449.011 |
| 0.7347222222222222 | 447.487 |
| 0.7354166666666666 | 445.971 |
| 0.7361111111111112 | 444.463 |
| 0.7368055555555556 | 444.463 |
| 0.7374999999999999 | 442.962 |
| 0.7381944444444444 | 441.469 |
| 0.7388888888888889 | 439.982 |
| 0.7395833333333334 | 439.982 |
| 0.7402777777777777 | 439.982 |
| 0.7409722222222223 | 438.503 |
| 0.7416666666666667 | 437.031 |
| 0.7423611111111111 | 437.031 |
| 0.7430555555555555 | 435.566 |
| 0.74375 | 434.107 |
| 0.7444444444444445 | 432.656 |
| 0.7451388888888889 | 431.211 |
| 0.7458333333333332 | 428.341 |
| 0.7465277777777778 | 426.916 |
| 0.7472222222222222 | 425.497 |
| 0.7479166666666667 | 424.085 |
| 0.748611111111111 | 422.678 |
| 0.7493055555555556 | 421.278 |
| 0.75 | 419.883 |
| 0.7506944444444444 | 418.495 |
| 0.751388888888889 | 417.112 |
| 0.7520833333333333 | 415.735 |
| 0.7527777777777778 | 414.364 |
| 0.7534722222222222 | 412.998 |
| 0.7541666666666668 | 411.638 |
| 0.7548611111111111 | 411.638 |
| 0.7555555555555555 | 410.283 |
| 0.75625 | 408.934 |
| 0.7569444444444445 | 408.934 |
| 0.7576388888888889 | 407.589 |
| 0.7583333333333333 | 408.934 |
| 0.7590277777777777 | 410.283 |
| 0.7597222222222223 | 408.934 |
| 0.7604166666666666 | 408.934 |
| 0.7611111111111111 | 404.916 |
| 0.7618055555555556 | 402.262 |
| 0.7625000000000001 | 400.943 |
| 0.7631944444444444 | 399.628 |
| 0.7638888888888888 | 398.318 |
| 0.7645833333333334 | 395.711 |
| 0.7652777777777778 | 394.415 |
| 0.7659722222222222 | 391.834 |
| 0.7666666666666666 | 391.834 |
| 0.7673611111111112 | 391.834 |
| 0.7680555555555556 | 391.834 |
| 0.7687499999999999 | 394.415 |
| 0.7694444444444444 | 395.711 |
| 0.7701388888888889 | 394.415 |
| 0.7708333333333334 | 379.171 |
| 0.7715277777777777 | 375.442 |
| 0.7722222222222223 | 357.196 |
| 0.7729166666666667 | 365.635 |
| 0.7736111111111111 | 351.235 |
| 0.7743055555555555 | 353.613 |
| 0.775 | 358.394 |
| 0.7756944444444445 | 351.235 |
| 0.7763888888888889 | 344.144 |
| 0.7770833333333332 | 344.144 |
| 0.7777777777777778 | 342.968 |
| 0.7784722222222222 | 342.968 |
| 0.7791666666666667 | 341.794 |
| 0.779861111111111 | 335.941 |
| 0.7805555555555556 | 325.473 |
| 0.78125 | 316.215 |
| 0.7819444444444444 | 309.284 |
| 0.782638888888889 | 306.974 |
| 0.7833333333333333 | 306.974 |
| 0.7840277777777778 | 303.509 |
| 0.7847222222222222 | 301.198 |
| 0.7854166666666668 | 300.041 |
| 0.7861111111111111 | 302.353 |
| 0.7868055555555555 | 304.664 |
| 0.7875 | 302.353 |
| 0.7881944444444445 | 297.728 |
| 0.7888888888888889 | 288.455 |
| 0.7895833333333333 | 279.136 |
| 0.7902777777777777 | 269.754 |
| 0.7909722222222223 | 259.104 |
| 0.7916666666666666 | 249.538 |
| 0.7923611111111111 | 241.083 |
| 0.7930555555555556 | 234.99 |
| 0.7937500000000001 | 230.083 |
| 0.7944444444444444 | 222.665 |
| 0.7951388888888888 | 218.93 |
| 0.7958333333333334 | 216.43 |
| 0.7965277777777778 | 212.664 |
| 0.7972222222222222 | 207.615 |
| 0.7979166666666666 | 202.534 |
| 0.7986111111111112 | 196.135 |
| 0.7993055555555556 | 190.979 |
| 0.7999999999999999 | 185.79 |
| 0.8006944444444444 | 180.569 |
| 0.8013888888888889 | 175.315 |
| 0.8020833333333334 | 170.029 |
| 0.8027777777777777 | 164.712 |
| 0.8034722222222223 | 159.364 |
| 0.8041666666666667 | 153.986 |
| 0.8048611111111111 | 148.579 |
| 0.8055555555555555 | 143.144 |
| 0.80625 | 137.683 |
| 0.8069444444444445 | 130.821 |
| 0.8076388888888889 | 125.304 |
| 0.8083333333333332 | 118.378 |
| 0.8090277777777778 | 111.42 |
| 0.8097222222222222 | 105.834 |
| 0.8104166666666667 | 100.233 |
| 0.811111111111111 | 93.212 |
| 0.8118055555555556 | 88.991 |
| 0.8125 | 83.356 |
| 0.8131944444444444 | 77.715 |
| 0.813888888888889 | 72.069 |
| 0.8145833333333333 | 66.423 |
| 0.8152777777777778 | 59.368 |
| 0.8159722222222222 | 55.139 |
| 0.8166666666666668 | 50.914 |
| 0.8173611111111111 | 45.29 |
| 0.8180555555555555 | 42.483 |
| 0.81875 | 38.28 |
| 0.8194444444444445 | 35.483 |
| 0.8201388888888889 | 31.297 |
| 0.8208333333333333 | 28.514 |
| 0.8215277777777777 | 25.736 |
| 0.8222222222222223 | 22.965 |
| 0.8229166666666666 | 20.201 |
| 0.8236111111111111 | 17.444 |
| 0.8243055555555556 | 16.069 |
| 0.8250000000000001 | 13.325 |
| 0.8256944444444444 | 11.956 |
| 0.8263888888888888 | 9.225 |
| 0.8270833333333334 | 7.862 |
| 0.8277777777777778 | 6.503 |
| 0.8284722222222222 | 5.146 |
| 0.8291666666666666 | 3.791 |
| 0.8298611111111112 | 3.791 |
| 0.8305555555555556 | 2.439 |
| 0.8312499999999999 | 2.439 |
| 0.8319444444444444 | 1.09 |
| 0.8326388888888889 | 1.09 |
| 0.8333333333333334 | 1.09 |
| 0.8340277777777777 | -0.256 |
| 0.8347222222222223 | -0.256 |
| 0.8354166666666667 | -0.256 |
| 0.8361111111111111 | -0.256 |
| 0.8368055555555555 | -0.256 |
| 0.8375 | -0.256 |
| 0.8381944444444445 | -0.256 |
| 0.8388888888888889 | -0.256 |
| 0.8395833333333332 | -0.256 |
| 0.8402777777777778 | -0.256 |
| 0.8409722222222222 | -0.256 |
| 0.8416666666666667 | -0.256 |
| 0.842361111111111 | -0.256 |
| 0.8430555555555556 | -0.256 |
| 0.84375 | -0.256 |
| 0.8444444444444444 | -0.256 |
| 0.845138888888889 | -0.256 |
| 0.8458333333333333 | -0.256 |
| 0.8465277777777778 | -0.256 |
| 0.8472222222222222 | -0.256 |
| 0.8479166666666668 | -0.256 |
| 0.8486111111111111 | -0.256 |
| 0.8493055555555555 | -0.256 |
| 0.85 | -0.256 |
| 0.8506944444444445 | -0.256 |
| 0.8513888888888889 | -0.256 |
| 0.8520833333333333 | -0.256 |
| 0.8527777777777777 | -0.256 |
| 0.8534722222222223 | -0.256 |
| 0.8541666666666666 | -0.256 |
| 0.8548611111111111 | -0.256 |
| 0.8555555555555556 | -0.256 |
| 0.8562500000000001 | -0.256 |
| 0.8569444444444444 | -0.256 |
| 0.8576388888888888 | -0.256 |
| 0.8583333333333334 | -0.256 |
| 0.8590277777777778 | -0.256 |
| 0.8597222222222222 | -0.256 |
| 0.8604166666666666 | -0.256 |
| 0.8611111111111112 | -0.256 |
| 0.8618055555555556 | -0.256 |
| 0.8624999999999999 | -0.256 |
| 0.8631944444444444 | -0.256 |
| 0.8638888888888889 | -0.256 |
| 0.8645833333333334 | -0.256 |
| 0.8652777777777777 | -0.256 |
| 0.8659722222222223 | -0.256 |
| 0.8666666666666667 | -0.256 |
| 0.8673611111111111 | -0.256 |
| 0.8680555555555555 | -0.256 |
| 0.86875 | -0.256 |
| 0.8694444444444445 | -0.256 |
| 0.8701388888888889 | -0.256 |
| 0.8708333333333332 | -0.256 |
| 0.8715277777777778 | -0.256 |
| 0.8722222222222222 | -0.256 |
| 0.8729166666666667 | -0.256 |
| 0.873611111111111 | -0.256 |
| 0.8743055555555556 | -0.256 |
| 0.875 | -0.256 |
| 0.8756944444444444 | -0.256 |
| 0.876388888888889 | -0.256 |
| 0.8770833333333333 | -0.256 |
| 0.8777777777777778 | -0.256 |
| 0.8784722222222222 | -0.256 |
| 0.8791666666666668 | -0.256 |
| 0.8798611111111111 | -0.256 |
| 0.8805555555555555 | -0.256 |
| 0.88125 | -0.256 |
| 0.8819444444444445 | -0.256 |
| 0.8826388888888889 | -0.256 |
| 0.8833333333333333 | -0.256 |
| 0.8840277777777777 | -0.256 |
| 0.8847222222222223 | -0.256 |
| 0.8854166666666666 | -0.256 |
| 0.8861111111111111 | -0.256 |
| 0.8868055555555556 | -0.256 |
| 0.8875000000000001 | -0.256 |
| 0.8881944444444444 | -0.256 |
| 0.8888888888888888 | -0.256 |
| 0.8895833333333334 | -0.256 |
| 0.8902777777777778 | -0.256 |
| 0.8909722222222222 | -0.256 |
| 0.8916666666666666 | -0.256 |
| 0.8923611111111112 | -0.256 |
| 0.8930555555555556 | -0.256 |
| 0.8937499999999999 | -0.256 |
| 0.8944444444444444 | -0.256 |
| 0.8951388888888889 | -0.256 |
| 0.8958333333333334 | -0.256 |
| 0.8965277777777777 | -0.256 |
| 0.8972222222222223 | -0.256 |
| 0.8979166666666667 | -0.256 |
| 0.8986111111111111 | -0.256 |
| 0.8993055555555555 | -0.256 |
| 0.9 | -0.256 |
| 0.9006944444444445 | -0.256 |
| 0.9013888888888889 | -0.256 |
| 0.9020833333333332 | -0.256 |
| 0.9027777777777778 | -0.256 |
| 0.9034722222222222 | -0.256 |
| 0.9041666666666667 | -0.256 |
| 0.904861111111111 | -0.256 |
| 0.9055555555555556 | -0.256 |
| 0.90625 | -0.256 |
| 0.9069444444444444 | -0.256 |
| 0.907638888888889 | -0.256 |
| 0.9083333333333333 | -0.256 |
| 0.9090277777777778 | -0.256 |
| 0.9097222222222222 | -0.256 |
| 0.9104166666666668 | -0.256 |
| 0.9111111111111111 | -0.256 |
| 0.9118055555555555 | -0.256 |
| 0.9125 | -0.256 |
| 0.9131944444444445 | -0.256 |
| 0.9138888888888889 | -0.256 |
| 0.9145833333333333 | -0.256 |
| 0.9152777777777777 | -0.256 |
| 0.9159722222222223 | -0.256 |
| 0.9166666666666666 | -0.256 |
| 0.9173611111111111 | -0.256 |
| 0.9180555555555556 | -0.256 |
| 0.9187500000000001 | -0.256 |
| 0.9194444444444444 | -0.256 |
| 0.9201388888888888 | -0.256 |
| 0.9208333333333334 | -0.256 |
| 0.9215277777777778 | -0.256 |
| 0.9222222222222222 | -0.256 |
| 0.9229166666666666 | -0.256 |
| 0.9236111111111112 | -0.256 |
| 0.9243055555555556 | -0.256 |
| 0.9249999999999999 | -0.256 |
| 0.9256944444444444 | -0.256 |
| 0.9263888888888889 | -0.256 |
| 0.9270833333333334 | -0.256 |
| 0.9277777777777777 | -0.256 |
| 0.9284722222222223 | -0.256 |
| 0.9291666666666667 | -0.256 |
| 0.9298611111111111 | -0.256 |
| 0.9305555555555555 | -0.256 |
| 0.93125 | -0.256 |
| 0.9319444444444445 | -0.256 |
| 0.9326388888888889 | -0.256 |
| 0.9333333333333332 | -0.256 |
| 0.9340277777777778 | -0.256 |
| 0.9347222222222222 | -0.256 |
| 0.9354166666666667 | -0.256 |
| 0.936111111111111 | -0.256 |
| 0.9368055555555556 | -0.256 |
| 0.9375 | -0.256 |
| 0.9381944444444444 | -0.256 |
| 0.938888888888889 | -0.256 |
| 0.9395833333333333 | -0.256 |
| 0.9402777777777778 | -0.256 |
| 0.9409722222222222 | -0.256 |
| 0.9416666666666668 | -0.256 |
| 0.9423611111111111 | -0.256 |
| 0.9430555555555555 | -0.256 |
| 0.94375 | -0.256 |
| 0.9444444444444445 | -0.256 |
| 0.9451388888888889 | -0.256 |
| 0.9458333333333333 | -0.256 |
| 0.9465277777777777 | -0.256 |
| 0.9472222222222223 | -0.256 |
| 0.9479166666666666 | -0.256 |
| 0.9486111111111111 | -0.256 |
| 0.9493055555555556 | -0.256 |
| 0.9500000000000001 | -0.256 |
| 0.9506944444444444 | -0.256 |
| 0.9513888888888888 | -0.256 |
| 0.9520833333333334 | -0.256 |
| 0.9527777777777778 | -0.256 |
| 0.9534722222222222 | -0.256 |
| 0.9541666666666666 | -0.256 |
| 0.9548611111111112 | -0.256 |
| 0.9555555555555556 | -0.256 |
| 0.9562499999999999 | -0.256 |
| 0.9569444444444444 | -0.256 |
| 0.9576388888888889 | -0.256 |
| 0.9583333333333334 | -0.256 |
| 0.9590277777777777 | -0.256 |
| 0.9597222222222223 | -0.256 |
| 0.9604166666666667 | -0.256 |
| 0.9611111111111111 | -0.256 |
| 0.9618055555555555 | -0.256 |
| 0.9625 | -0.256 |
| 0.9631944444444445 | -0.256 |
| 0.9638888888888889 | -0.256 |
| 0.9645833333333332 | -0.256 |
| 0.9652777777777778 | -0.256 |
| 0.9659722222222222 | -0.256 |
| 0.9666666666666667 | -0.256 |
| 0.967361111111111 | -0.256 |
| 0.9680555555555556 | -0.256 |
| 0.96875 | -0.256 |
| 0.9694444444444444 | -0.256 |
| 0.970138888888889 | -0.256 |
| 0.9708333333333333 | -0.256 |
| 0.9715277777777778 | -0.256 |
| 0.9722222222222222 | -0.256 |
| 0.9729166666666668 | -0.256 |
| 0.9736111111111111 | -0.256 |
| 0.9743055555555555 | -0.256 |
| 0.975 | -0.256 |
| 0.9756944444444445 | -0.256 |
| 0.9763888888888889 | -0.256 |
| 0.9770833333333333 | -0.256 |
| 0.9777777777777777 | -0.256 |
| 0.9784722222222223 | -0.256 |
| 0.9791666666666666 | -0.256 |
| 0.9798611111111111 | -0.256 |
| 0.9805555555555556 | -0.256 |
| 0.9812500000000001 | -0.256 |
| 0.9819444444444444 | -0.256 |
| 0.9826388888888888 | -0.256 |
| 0.9833333333333334 | -0.256 |
| 0.9840277777777778 | -0.256 |
| 0.9847222222222222 | -0.256 |
| 0.9854166666666666 | -0.256 |
| 0.9861111111111112 | -0.256 |
| 0.9868055555555556 | -0.256 |
| 0.9874999999999999 | -0.256 |
| 0.9881944444444444 | -0.256 |
| 0.9888888888888889 | -0.256 |
| 0.9895833333333334 | -0.256 |
| 0.9902777777777777 | -0.256 |
| 0.9909722222222223 | -0.256 |
| 0.9916666666666667 | -0.256 |
| 0.9923611111111111 | -0.256 |
| 0.9930555555555555 | -0.256 |
| 0.99375 | -0.256 |
| 0.9944444444444445 | -0.256 |
| 0.9951388888888889 | -0.256 |
| 0.9958333333333332 | -0.256 |
| 0.9965277777777778 | -0.256 |
| 0.9972222222222222 | -0.256 |
| 0.9979166666666667 | -0.256 |
| 0.998611111111111 | -0.256 |
| 0.9993055555555556 | 0 |